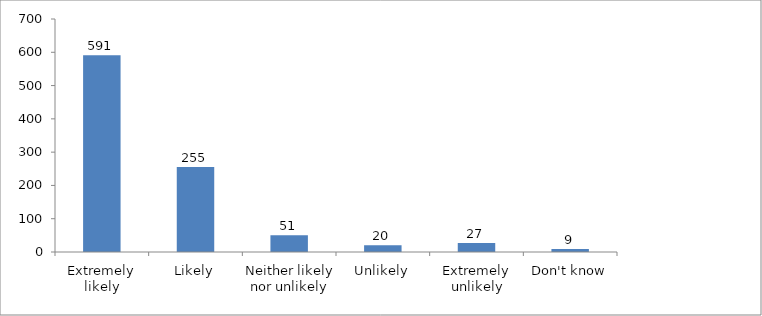
| Category | Series 0 |
|---|---|
| Extremely likely | 591 |
| Likely | 255 |
| Neither likely nor unlikely | 50 |
| Unlikely | 20 |
| Extremely unlikely | 27 |
| Don't know | 9 |